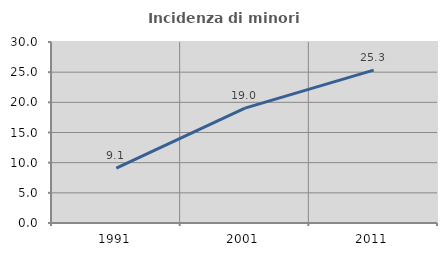
| Category | Incidenza di minori stranieri |
|---|---|
| 1991.0 | 9.091 |
| 2001.0 | 19.048 |
| 2011.0 | 25.346 |